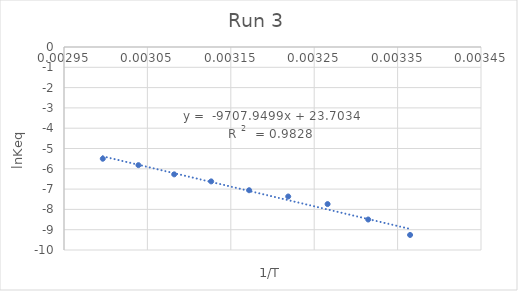
| Category | Series 0 |
|---|---|
| 0.003364963994885255 | -9.259 |
| 0.003314770617873243 | -8.498 |
| 0.0032660526487686982 | -7.738 |
| 0.0032188495831589788 | -7.364 |
| 0.003171985028230667 | -7.056 |
| 0.0031264655307175235 | -6.62 |
| 0.0030821390044691015 | -6.273 |
| 0.0030392365437802026 | -5.82 |
| 0.002996524032122737 | -5.504 |